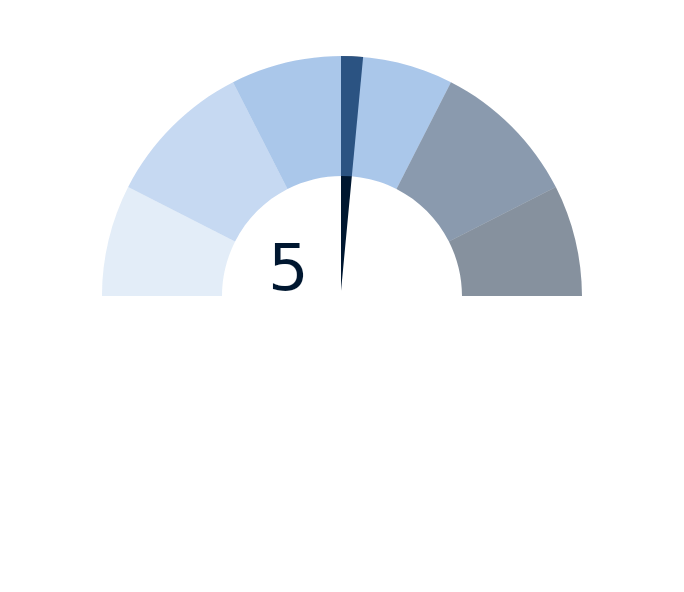
| Category | Series 2 |
|---|---|
| 0 | 5 |
| 1 | 0.3 |
| 2 | 14.7 |